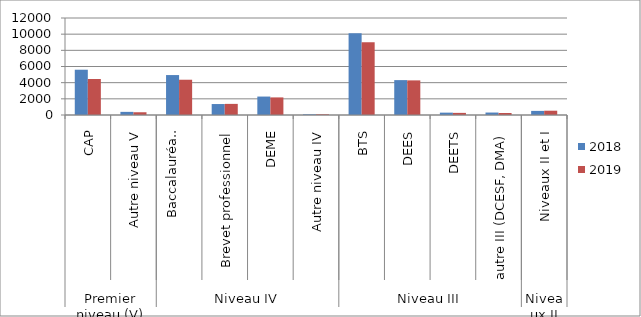
| Category | 2018 | 2019 |
|---|---|---|
| 0 | 5601 | 4453 |
| 1 | 388 | 340 |
| 2 | 4941 | 4363 |
| 3 | 1356 | 1375 |
| 4 | 2282 | 2176 |
| 5 | 81 | 85 |
| 6 | 10116 | 9006 |
| 7 | 4316 | 4282 |
| 8 | 292 | 262 |
| 9 | 304 | 249 |
| 10 | 507 | 531 |